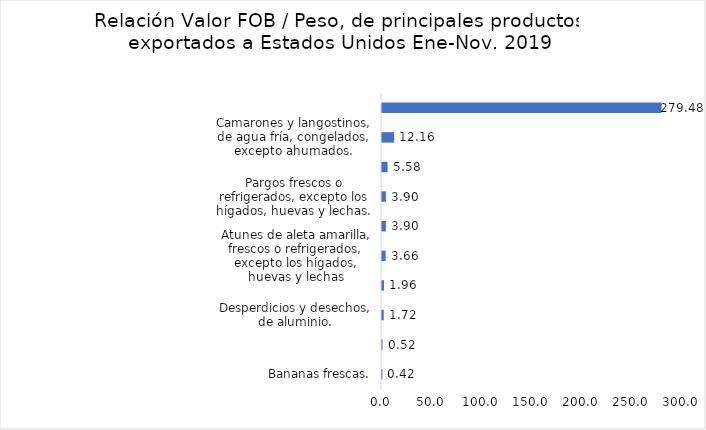
| Category | Series 0 |
|---|---|
| Bananas frescas. | 0.416 |
| Azúcar de caña en bruto sin adición de colorantes | 0.518 |
| Desperdicios y desechos, de aluminio. | 1.722 |
| Los demás salmónidos, frescos o refrigerados, excepto los hígados, huevas y lechas. | 1.957 |
| Atunes de aleta amarilla, frescos o refrigerados, excepto los hígados, huevas y lechas | 3.658 |
| Desperdicios y desechos, de fundición, de hierro o acero. | 3.898 |
| Pargos frescos o refrigerados, excepto los hígados, huevas y lechas. | 3.901 |
| Café tostado, sin descafeinar. | 5.581 |
| Camarones y langostinos, de agua fría, congelados, excepto ahumados. | 12.155 |
| Los demás productos de origen animal no expresados ni comprendidos en otra parte | 279.483 |